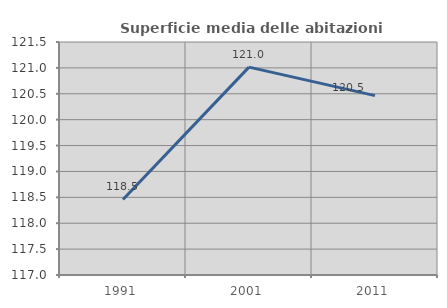
| Category | Superficie media delle abitazioni occupate |
|---|---|
| 1991.0 | 118.459 |
| 2001.0 | 121.015 |
| 2011.0 | 120.464 |